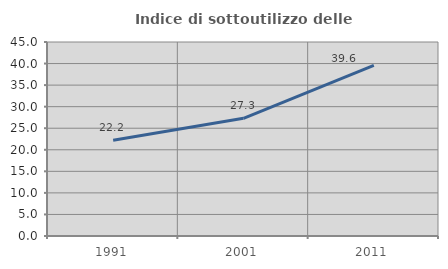
| Category | Indice di sottoutilizzo delle abitazioni  |
|---|---|
| 1991.0 | 22.228 |
| 2001.0 | 27.29 |
| 2011.0 | 39.565 |